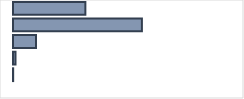
| Category | Series 0 |
|---|---|
| 0 | 31.879 |
| 1 | 56.788 |
| 2 | 10.131 |
| 3 | 1.13 |
| 4 | 0.072 |